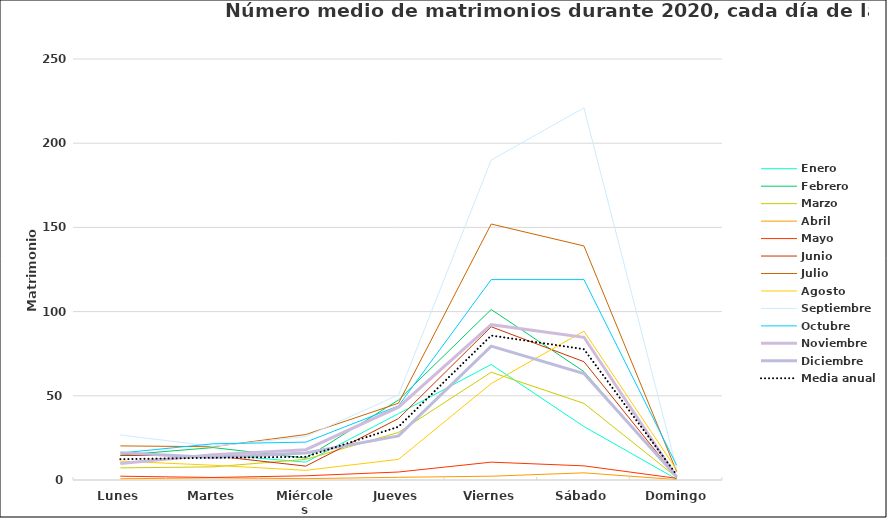
| Category | Enero | Febrero | Marzo | Abril | Mayo | Junio | Julio | Agosto | Septiembre | Octubre | Noviembre | Diciembre | Media anual |
|---|---|---|---|---|---|---|---|---|---|---|---|---|---|
| Lunes | 10 | 14.75 | 7.2 | 0.75 | 2.25 | 14.6 | 20.25 | 11.2 | 26.75 | 16 | 9.8 | 16.25 | 12.346 |
| Martes | 15.25 | 19.25 | 7.8 | 1.25 | 1.5 | 14.4 | 19.75 | 8.75 | 20 | 21.5 | 15 | 13.4 | 13.212 |
| Miércoles | 10.6 | 13 | 12.25 | 0.8 | 2.5 | 8.25 | 27 | 5.75 | 25.8 | 22.5 | 18 | 16 | 13.774 |
| Jueves | 39.4 | 47.5 | 28.25 | 1.6 | 4.75 | 36.5 | 45.6 | 12.25 | 50.5 | 44 | 43.25 | 26.2 | 31.623 |
| Viernes | 68.6 | 101.25 | 64 | 2.25 | 10.6 | 91 | 152 | 57.25 | 190 | 119 | 92.25 | 79.5 | 85.788 |
| Sábado | 31.75 | 64.4 | 45.5 | 4.25 | 8.4 | 70.25 | 139 | 88.4 | 221 | 119 | 84.75 | 63.25 | 77.692 |
| Domingo | 0.5 | 1.5 | 1.6 | 0.25 | 1 | 1.75 | 5 | 6 | 6.75 | 8.75 | 1.8 | 2 | 3.038 |